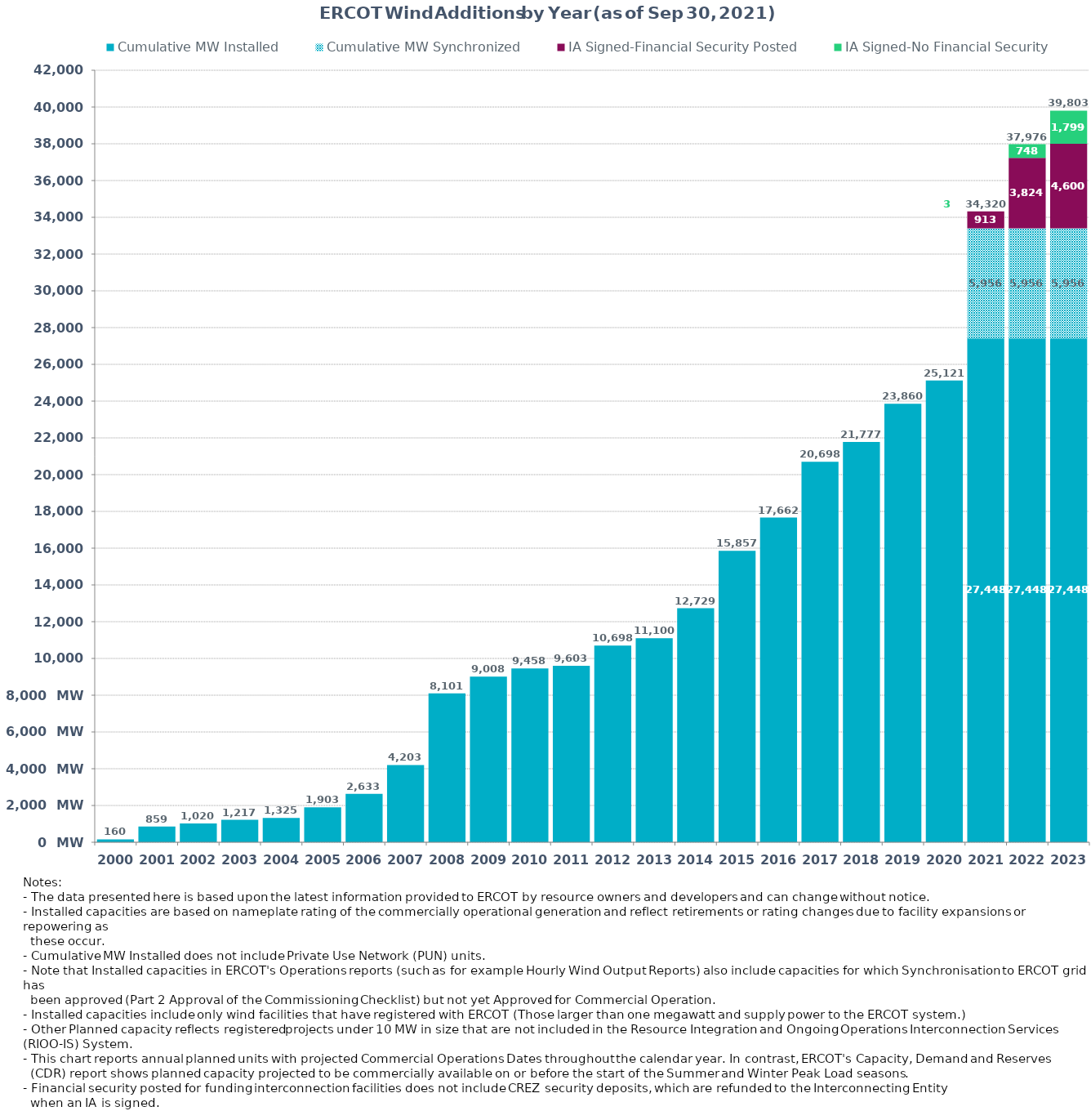
| Category | Cumulative MW Installed | Cumulative MW Synchronized | IA Signed-Financial Security Posted  | IA Signed-No Financial Security  | Other Planned | Cumulative Installed and Planned |
|---|---|---|---|---|---|---|
| 2000.0 | 160.37 | 0 | 0 | 0 | 0 | 160.37 |
| 2001.0 | 859.29 | 0 | 0 | 0 | 0 | 859.29 |
| 2002.0 | 1019.79 | 0 | 0 | 0 | 0 | 1019.79 |
| 2003.0 | 1217.29 | 0 | 0 | 0 | 0 | 1217.29 |
| 2004.0 | 1325.29 | 0 | 0 | 0 | 0 | 1325.29 |
| 2005.0 | 1902.69 | 0 | 0 | 0 | 0 | 1902.69 |
| 2006.0 | 2633.39 | 0 | 0 | 0 | 0 | 2633.39 |
| 2007.0 | 4203.41 | 0 | 0 | 0 | 0 | 4203.41 |
| 2008.0 | 8101.01 | 0 | 0 | 0 | 0 | 8101.01 |
| 2009.0 | 9007.57 | 0 | 0 | 0 | 0 | 9007.57 |
| 2010.0 | 9458.49 | 0 | 0 | 0 | 0 | 9458.49 |
| 2011.0 | 9603.49 | 0 | 0 | 0 | 0 | 9603.49 |
| 2012.0 | 10698.35 | 0 | 0 | 0 | 0 | 10698.35 |
| 2013.0 | 11100.05 | 0 | 0 | 0 | 0 | 11100.05 |
| 2014.0 | 12728.93 | 0 | 0 | 0 | 0 | 12728.93 |
| 2015.0 | 15857.48 | 0 | 0 | 0 | 0 | 15857.48 |
| 2016.0 | 17662.45 | 0 | 0 | 0 | 0 | 17662.45 |
| 2017.0 | 20697.84 | 0 | 0 | 0 | 0 | 20697.84 |
| 2018.0 | 21777 | 0 | 0 | 0 | 0 | 21777 |
| 2019.0 | 23860 | 0 | 0 | 0 | 0 | 23860 |
| 2020.0 | 25121 | 0 | 0 | 0 | 0 | 25121 |
| 2021.0 | 27447.52 | 5956 | 913.32 | 3 | 0 | 34319.84 |
| 2022.0 | 27447.52 | 5956 | 3824.48 | 747.5 | 0 | 37975.5 |
| 2023.0 | 27447.52 | 5956 | 4600 | 1799.1 | 0 | 39802.62 |